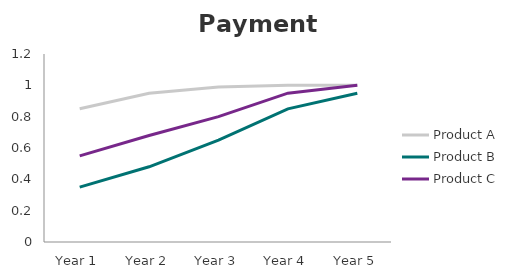
| Category | Product A | Product B | Product C |
|---|---|---|---|
| Year 1 | 0.85 | 0.35 | 0.55 |
| Year 2 | 0.95 | 0.48 | 0.68 |
| Year 3 | 0.99 | 0.65 | 0.8 |
| Year 4 | 1 | 0.85 | 0.95 |
| Year 5 | 1 | 0.95 | 1 |